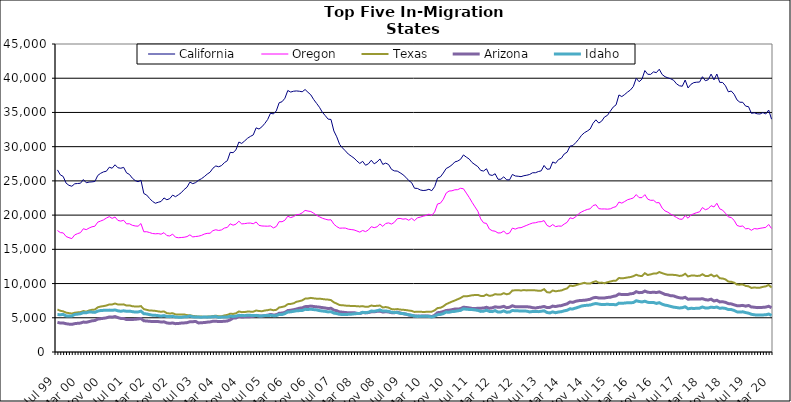
| Category | California | Oregon | Texas | Arizona | Idaho |
|---|---|---|---|---|---|
| Jul 99 | 26605 | 17749 | 6209 | 4339 | 5471 |
| Aug 99 | 25882 | 17447 | 6022 | 4228 | 5444 |
| Sep 99 | 25644 | 17401 | 5941 | 4237 | 5488 |
| Oct 99 | 24669 | 16875 | 5751 | 4134 | 5279 |
| Nov 99 | 24353 | 16701 | 5680 | 4073 | 5260 |
| Dec 99 | 24218 | 16570 | 5619 | 4042 | 5269 |
| Jan 00 | 24574 | 17109 | 5736 | 4142 | 5485 |
| Feb 00 | 24620 | 17295 | 5789 | 4192 | 5530 |
| Mar 00 | 24655 | 17436 | 5826 | 4226 | 5590 |
| Apr 00 | 25195 | 18009 | 5980 | 4375 | 5748 |
| May 00 | 24730 | 17875 | 5897 | 4337 | 5729 |
| Jun 00 | 24825 | 18113 | 6070 | 4444 | 5853 |
| Jul 00 | 24857 | 18294 | 6163 | 4555 | 5824 |
| Aug 00 | 24913 | 18376 | 6199 | 4603 | 5788 |
| Sep 00 | 25792 | 18971 | 6529 | 4804 | 5976 |
| Oct 00 | 26106 | 19135 | 6643 | 4870 | 6058 |
| Nov 00 | 26315 | 19306 | 6705 | 4926 | 6085 |
| Dec 00 | 26415 | 19570 | 6793 | 4991 | 6096 |
| Jan 01 | 26995 | 19781 | 6942 | 5122 | 6119 |
| Feb 01 | 26851 | 19519 | 6948 | 5089 | 6090 |
| Mar 01 | 27352 | 19720 | 7080 | 5180 | 6143 |
| Apr 01 | 26918 | 19221 | 6943 | 5020 | 6020 |
| May 01 | 26848 | 19126 | 6924 | 4899 | 5950 |
| Jun 01 | 26974 | 19241 | 6959 | 4895 | 6019 |
| Jul 01 | 26172 | 18725 | 6778 | 4737 | 5951 |
| Aug 01 | 25943 | 18736 | 6810 | 4757 | 5973 |
| Sep 01 | 25399 | 18514 | 6688 | 4753 | 5895 |
| Oct 01 | 25050 | 18415 | 6650 | 4780 | 5833 |
| Nov 01 | 24873 | 18381 | 6631 | 4826 | 5850 |
| Dec 01 | 25099 | 18765 | 6708 | 4898 | 5969 |
| Jan 02 | 23158 | 17561 | 6261 | 4560 | 5595 |
| Feb 02 | 22926 | 17573 | 6162 | 4531 | 5560 |
| Mar 02 | 22433 | 17452 | 6052 | 4481 | 5458 |
| Apr 02 | 22012 | 17314 | 6046 | 4458 | 5380 |
| May 02 | 21733 | 17267 | 6007 | 4452 | 5358 |
| Jun 02 | 21876 | 17298 | 5933 | 4444 | 5315 |
| Jul 02 | 21997 | 17209 | 5873 | 4383 | 5243 |
| Aug 02 | 22507 | 17436 | 5929 | 4407 | 5315 |
| Sep 02 | 22244 | 17010 | 5672 | 4248 | 5192 |
| Oct 02 | 22406 | 16952 | 5625 | 4191 | 5167 |
| Nov 02 | 22922 | 17223 | 5663 | 4242 | 5221 |
| Dec 02 | 22693 | 16770 | 5499 | 4142 | 5120 |
| Jan 03 | 22964 | 16694 | 5463 | 4166 | 5089 |
| Feb 03 | 23276 | 16727 | 5461 | 4226 | 5077 |
| Mar 03 | 23736 | 16766 | 5486 | 4251 | 5145 |
| Apr 03 | 24079 | 16859 | 5389 | 4289 | 5145 |
| May 03 | 24821 | 17117 | 5378 | 4415 | 5254 |
| Jun 03 | 24592 | 16812 | 5273 | 4426 | 5135 |
| Jul 03 | 24754 | 16875 | 5226 | 4466 | 5124 |
| Aug 03 | 25092 | 16922 | 5181 | 4244 | 5100 |
| Sep 03 | 25316 | 17036 | 5181 | 4279 | 5086 |
| Oct 03 | 25622 | 17228 | 5139 | 4301 | 5110 |
| Nov 03 | 25984 | 17335 | 5175 | 4362 | 5091 |
| Dec 03 | 26269 | 17350 | 5189 | 4396 | 5113 |
| Jan 04 | 26852 | 17734 | 5255 | 4492 | 5152 |
| Feb 04 | 27184 | 17860 | 5301 | 4502 | 5183 |
| Mar 04 | 27062 | 17757 | 5227 | 4443 | 5056 |
| Apr 04 | 27238 | 17840 | 5227 | 4461 | 5104 |
| May 04 | 27671 | 18113 | 5345 | 4493 | 5095 |
| Jun 04 | 27949 | 18201 | 5416 | 4532 | 5103 |
| Jul 04 | 29172 | 18727 | 5597 | 4697 | 5231 |
| Aug 04 | 29122 | 18529 | 5561 | 4945 | 5197 |
| Sep 04 | 29542 | 18678 | 5656 | 4976 | 5237 |
| Oct 04 | 30674 | 19108 | 5922 | 5188 | 5363 |
| Nov 04 | 30472 | 18716 | 5823 | 5106 | 5321 |
| Dec 04 | 30831 | 18755 | 5838 | 5135 | 5312 |
| Jan 05 | 31224 | 18823 | 5906 | 5155 | 5374 |
| Feb 05 | 31495 | 18842 | 5898 | 5168 | 5357 |
| Mar 05 | 31714 | 18738 | 5894 | 5212 | 5313 |
| Apr 05 | 32750 | 18998 | 6060 | 5340 | 5350 |
| May 05 | 32575 | 18504 | 5989 | 5269 | 5276 |
| Jun 05 | 32898 | 18414 | 5954 | 5252 | 5271 |
| Jul 05 | 33384 | 18395 | 6062 | 5322 | 5322 |
| Aug 05 | 33964 | 18381 | 6113 | 5375 | 5316 |
| Sep 05 | 34897 | 18426 | 6206 | 5493 | 5362 |
| Oct 05 | 34780 | 18132 | 6100 | 5408 | 5308 |
| Nov 05 | 35223 | 18332 | 6162 | 5434 | 5314 |
| Dec 05 | 36415 | 19047 | 6508 | 5658 | 5487 |
| Jan 06 | 36567 | 19032 | 6576 | 5688 | 5480 |
| Feb 06 | 37074 | 19257 | 6692 | 5792 | 5616 |
| Mar 06 | 38207 | 19845 | 6993 | 6052 | 5850 |
| Apr 06 | 37976 | 19637 | 7024 | 6101 | 5864 |
| May 06 | 38099 | 19781 | 7114 | 6178 | 5943 |
| Jun 06 | 38141 | 20061 | 7331 | 6276 | 6018 |
| Jul 06 | 38097 | 20111 | 7431 | 6399 | 6046 |
| Aug 06 | 38021 | 20333 | 7542 | 6450 | 6064 |
| Sep 06 | 38349 | 20686 | 7798 | 6627 | 6232 |
| Oct 06 | 37947 | 20591 | 7825 | 6647 | 6216 |
| Nov 06 | 37565 | 20526 | 7907 | 6707 | 6244 |
| Dec 06 | 36884 | 20272 | 7840 | 6648 | 6192 |
| Jan 07 | 36321 | 19984 | 7789 | 6597 | 6151 |
| Feb 07 | 35752 | 19752 | 7799 | 6554 | 6048 |
| Mar 07 | 35025 | 19547 | 7737 | 6487 | 5989 |
| Apr 07 | 34534 | 19412 | 7685 | 6430 | 5937 |
| May 07 | 34022 | 19296 | 7654 | 6353 | 5858 |
| Jun 07 | 33974 | 19318 | 7577 | 6390 | 5886 |
| Jul 07 | 32298 | 18677 | 7250 | 6117 | 5682 |
| Aug 07 | 31436 | 18322 | 7070 | 6034 | 5617 |
| Sep 07 | 30331 | 18087 | 6853 | 5847 | 5500 |
| Oct 07 | 29813 | 18108 | 6839 | 5821 | 5489 |
| Nov 07 | 29384 | 18105 | 6777 | 5769 | 5481 |
| Dec 07 | 28923 | 17949 | 6760 | 5733 | 5499 |
| Jan 08 | 28627 | 17890 | 6721 | 5732 | 5521 |
| Feb 08 | 28328 | 17834 | 6719 | 5749 | 5579 |
| Mar 08 | 27911 | 17680 | 6690 | 5650 | 5614 |
| Apr 08 | 27543 | 17512 | 6656 | 5612 | 5635 |
| May 08 | 27856 | 17754 | 6705 | 5774 | 5798 |
| Jun 08 | 27287 | 17589 | 6593 | 5717 | 5745 |
| Jul 08 | 27495 | 17834 | 6623 | 5761 | 5807 |
| Aug 08 | 28018 | 18309 | 6789 | 5867 | 5982 |
| Sep-08 | 27491 | 18164 | 6708 | 5864 | 5954 |
| Oct 08 | 27771 | 18291 | 6755 | 5942 | 6032 |
| Nov 08 | 28206 | 18706 | 6787 | 5970 | 6150 |
| Dec 08 | 27408 | 18353 | 6505 | 5832 | 5975 |
| Jan 09 | 27601 | 18778 | 6569 | 5890 | 5995 |
| Feb 09 | 27394 | 18863 | 6483 | 5845 | 5936 |
| Mar 09 | 26690 | 18694 | 6273 | 5751 | 5806 |
| Apr 09 | 26461 | 18943 | 6222 | 5735 | 5777 |
| May 09 | 26435 | 19470 | 6272 | 5819 | 5767 |
| Jun 09 | 26187 | 19522 | 6199 | 5700 | 5649 |
| Jul 09 | 25906 | 19408 | 6171 | 5603 | 5617 |
| Aug 09 | 25525 | 19469 | 6128 | 5533 | 5540 |
| Sep 09 | 25050 | 19249 | 6059 | 5405 | 5437 |
| Oct 09 | 24741 | 19529 | 6004 | 5349 | 5369 |
| Nov 09 | 23928 | 19187 | 5854 | 5271 | 5248 |
| Dec 09 | 23899 | 19607 | 5886 | 5261 | 5195 |
| Jan 10 | 23676 | 19703 | 5881 | 5232 | 5234 |
| Feb 10 | 23592 | 19845 | 5850 | 5272 | 5236 |
| Mar 10 | 23634 | 19946 | 5864 | 5278 | 5219 |
| Apr 10 | 23774 | 20134 | 5889 | 5257 | 5201 |
| May 10 | 23567 | 19966 | 5897 | 5172 | 5105 |
| Jun 10 | 24166 | 20464 | 6087 | 5356 | 5237 |
| Jul 10 | 25410 | 21627 | 6417 | 5742 | 5452 |
| Aug 10 | 25586 | 21744 | 6465 | 5797 | 5491 |
| Sep 10 | 26150 | 22314 | 6667 | 5907 | 5609 |
| Oct 10 | 26807 | 23219 | 6986 | 6070 | 5831 |
| Nov 10 | 27033 | 23520 | 7179 | 6100 | 5810 |
| Dec 10 | 27332 | 23551 | 7361 | 6182 | 5898 |
| Jan 11 | 27769 | 23697 | 7525 | 6276 | 5938 |
| Feb 11 | 27898 | 23718 | 7708 | 6267 | 6016 |
| Mar 11 | 28155 | 23921 | 7890 | 6330 | 6081 |
| Apr 11 | 28790 | 23847 | 8146 | 6544 | 6305 |
| May 11 | 28471 | 23215 | 8131 | 6502 | 6248 |
| Jun 11 | 28191 | 22580 | 8199 | 6445 | 6217 |
| Jul 11 | 27678 | 21867 | 8291 | 6368 | 6202 |
| Aug 11 | 27372 | 21203 | 8321 | 6356 | 6146 |
| Sep 11 | 27082 | 20570 | 8341 | 6387 | 6075 |
| Oct 11 | 26528 | 19442 | 8191 | 6402 | 5932 |
| Nov 11 | 26440 | 18872 | 8176 | 6426 | 5968 |
| Dec 11 | 26770 | 18784 | 8401 | 6533 | 6106 |
| Jan 12 | 25901 | 17963 | 8202 | 6390 | 5933 |
| Feb 12 | 25796 | 17718 | 8266 | 6456 | 5900 |
| Mar 12 | 26042 | 17647 | 8456 | 6600 | 6054 |
| Apr 12 | 25239 | 17386 | 8388 | 6534 | 5838 |
| May 12 | 25238 | 17407 | 8401 | 6558 | 5854 |
| Jun 12 | 25593 | 17673 | 8594 | 6669 | 6009 |
| Jul 12 | 25155 | 17237 | 8432 | 6474 | 5817 |
| Aug 12 | 25146 | 17391 | 8536 | 6539 | 5842 |
| Sep 12 | 25942 | 18102 | 8989 | 6759 | 6061 |
| Oct 12 | 25718 | 17953 | 9012 | 6618 | 6027 |
| Nov 12 | 25677 | 18134 | 9032 | 6611 | 6009 |
| Dec 12 | 25619 | 18166 | 8981 | 6601 | 5999 |
| Jan 13 | 25757 | 18344 | 9051 | 6627 | 5989 |
| Feb-13 | 25830 | 18512 | 9001 | 6606 | 5968 |
| Mar-13 | 25940 | 18689 | 9021 | 6577 | 5853 |
| Apr 13 | 26187 | 18844 | 9013 | 6478 | 5925 |
| May 13 | 26192 | 18884 | 9003 | 6431 | 5924 |
| Jun-13 | 26362 | 19013 | 8948 | 6508 | 5896 |
| Jul 13 | 26467 | 19037 | 8958 | 6559 | 5948 |
| Aug 13 | 27253 | 19198 | 9174 | 6655 | 6020 |
| Sep 13 | 26711 | 18501 | 8747 | 6489 | 5775 |
| Oct 13 | 26733 | 18301 | 8681 | 6511 | 5711 |
| Nov 13 | 27767 | 18620 | 8989 | 6709 | 5860 |
| Dec 13 | 27583 | 18320 | 8863 | 6637 | 5740 |
| Jan 14 | 28107 | 18409 | 8939 | 6735 | 5843 |
| Feb-14 | 28313 | 18383 | 8989 | 6779 | 5893 |
| Mar 14 | 28934 | 18696 | 9160 | 6918 | 6015 |
| Apr 14 | 29192 | 18946 | 9291 | 7036 | 6099 |
| May 14 | 30069 | 19603 | 9701 | 7314 | 6304 |
| Jun 14 | 30163 | 19487 | 9641 | 7252 | 6293 |
| Jul-14 | 30587 | 19754 | 9752 | 7415 | 6427 |
| Aug-14 | 31074 | 20201 | 9882 | 7499 | 6557 |
| Sep 14 | 31656 | 20459 | 9997 | 7536 | 6719 |
| Oct 14 | 32037 | 20663 | 10109 | 7555 | 6786 |
| Nov 14 | 32278 | 20825 | 9992 | 7628 | 6831 |
| Dec 14 | 32578 | 20918 | 10006 | 7705 | 6860 |
| Jan 15 | 33414 | 21396 | 10213 | 7906 | 7000 |
| Feb 15 | 33922 | 21518 | 10337 | 7982 | 7083 |
| Mar 15 | 33447 | 20942 | 10122 | 7891 | 7006 |
| Apr-15 | 33731 | 20893 | 10138 | 7906 | 6931 |
| May 15 | 34343 | 20902 | 10053 | 7895 | 6952 |
| Jun-15 | 34572 | 20870 | 10192 | 7973 | 6966 |
| Jul 15 | 35185 | 20916 | 10303 | 8000 | 6949 |
| Aug 15 | 35780 | 21115 | 10399 | 8126 | 6938 |
| Sep 15 | 36109 | 21246 | 10428 | 8207 | 6896 |
| Oct 15 | 37555 | 21908 | 10813 | 8477 | 7140 |
| Nov 15 | 37319 | 21750 | 10763 | 8390 | 7112 |
| Dec 15 | 37624 | 21990 | 10807 | 8395 | 7149 |
| Jan 16 | 37978 | 22248 | 10892 | 8388 | 7201 |
| Feb 16 | 38285 | 22369 | 10951 | 8508 | 7192 |
| Mar 16 | 38792 | 22506 | 11075 | 8547 | 7226 |
| Apr 16 | 39994 | 22999 | 11286 | 8815 | 7487 |
| May 16 | 39488 | 22548 | 11132 | 8673 | 7382 |
| Jun 16 | 39864 | 22556 | 11100 | 8682 | 7315 |
| Jul 16 | 41123 | 22989 | 11516 | 8903 | 7420 |
| Aug 16 | 40573 | 22333 | 11251 | 8731 | 7261 |
| Sep 16 | 40560 | 22162 | 11340 | 8692 | 7216 |
| Oct 16 | 40923 | 22172 | 11456 | 8742 | 7233 |
| Nov 16 | 40817 | 21818 | 11459 | 8685 | 7101 |
| Dec 16 | 41311 | 21815 | 11681 | 8783 | 7203 |
| Jan 17 | 40543 | 21029 | 11524 | 8609 | 6982 |
| Feb 17 | 40218 | 20613 | 11385 | 8416 | 6852 |
| Mar 17 | 40052 | 20425 | 11276 | 8354 | 6775 |
| Apr 17 | 39913 | 20147 | 11297 | 8218 | 6653 |
| May 17 | 39695 | 19910 | 11265 | 8196 | 6552 |
| Jun 17 | 39177 | 19650 | 11225 | 8034 | 6500 |
| Jul 17 | 38901 | 19419 | 11115 | 7923 | 6429 |
| Aug 17 | 38827 | 19389 | 11168 | 7867 | 6479 |
| Sep 17 | 39736 | 19936 | 11426 | 7991 | 6609 |
| Oct 17 | 38576 | 19547 | 11041 | 7708 | 6315 |
| Nov 17 | 39108 | 20013 | 11158 | 7746 | 6381 |
| Dec 17 | 39359 | 20202 | 11185 | 7743 | 6366 |
| Jan 18 | 39420 | 20362 | 11118 | 7736 | 6380 |
| Feb 18 | 39440 | 20476 | 11128 | 7741 | 6407 |
| Mar 18 | 40218 | 21106 | 11362 | 7789 | 6578 |
| Apr 18 | 39637 | 20788 | 11111 | 7642 | 6423 |
| May 18 | 39777 | 20933 | 11097 | 7591 | 6430 |
| Jun 18 | 40602 | 21381 | 11317 | 7721 | 6554 |
| Jul 18 | 39767 | 21189 | 11038 | 7445 | 6489 |
| Aug 18 | 40608 | 21729 | 11200 | 7560 | 6569 |
| Sep 18 | 39395 | 20916 | 10772 | 7318 | 6383 |
| Oct 18 | 39383 | 20724 | 10740 | 7344 | 6429 |
| Nov 18 | 38891 | 20265 | 10605 | 7255 | 6365 |
| Dec 18 | 38013 | 19741 | 10292 | 7069 | 6205 |
| Jan 19 | 38130 | 19643 | 10261 | 7032 | 6203 |
| Feb 19 | 37658 | 19237 | 10132 | 6892 | 6073 |
| Mar 19 | 36831 | 18492 | 9848 | 6766 | 5863 |
| Apr 19 | 36492 | 18349 | 9839 | 6763 | 5827 |
| May 19 | 36481 | 18407 | 9867 | 6809 | 5873 |
| Jun 19 | 35925 | 17998 | 9661 | 6698 | 5761 |
| Jul 19 | 35843 | 18049 | 9598 | 6800 | 5673 |
| Aug 19 | 34870 | 17785 | 9361 | 6577 | 5512 |
| Sep 19 | 34945 | 18038 | 9428 | 6547 | 5437 |
| Oct 19 | 34802 | 17977 | 9385 | 6483 | 5390 |
| Nov 19 | 34775 | 18072 | 9403 | 6511 | 5401 |
| Dec 19 | 34976 | 18140 | 9518 | 6521 | 5419 |
| Jan 20 | 34774 | 18209 | 9594 | 6561 | 5434 |
| Feb 20 | 35352 | 18632 | 9804 | 6682 | 5543 |
| Mar 20 | 34013 | 18041 | 9411 | 6464 | 5330 |